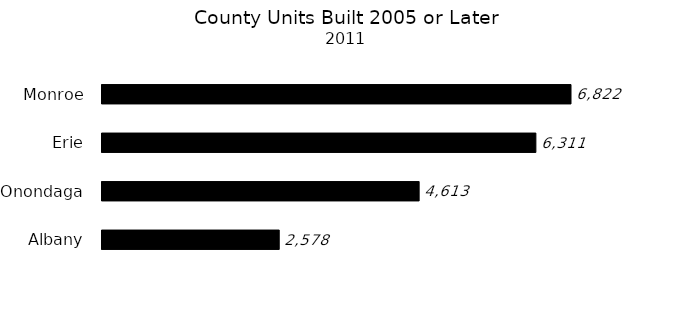
| Category | Series 0 |
|---|---|
| Albany | 2578 |
| Onondaga | 4613 |
| Erie | 6311 |
| Monroe | 6822 |